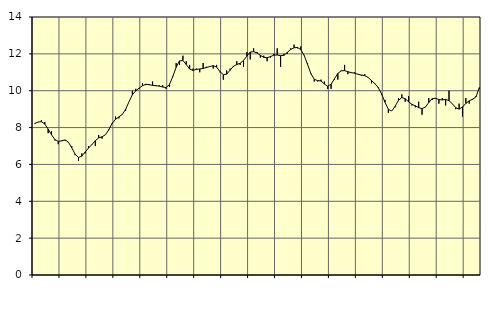
| Category | Piggar | Series 1 |
|---|---|---|
| nan | 8.2 | 8.22 |
| 87.0 | 8.3 | 8.3 |
| 87.0 | 8.4 | 8.32 |
| 87.0 | 8.3 | 8.19 |
| nan | 7.7 | 7.92 |
| 88.0 | 7.8 | 7.61 |
| 88.0 | 7.3 | 7.35 |
| 88.0 | 7.1 | 7.25 |
| nan | 7.3 | 7.28 |
| 89.0 | 7.3 | 7.33 |
| 89.0 | 7.2 | 7.21 |
| 89.0 | 7 | 6.9 |
| nan | 6.5 | 6.56 |
| 90.0 | 6.2 | 6.38 |
| 90.0 | 6.6 | 6.45 |
| 90.0 | 6.6 | 6.68 |
| nan | 7 | 6.89 |
| 91.0 | 7.1 | 7.08 |
| 91.0 | 7 | 7.29 |
| 91.0 | 7.6 | 7.44 |
| nan | 7.4 | 7.5 |
| 92.0 | 7.6 | 7.61 |
| 92.0 | 7.9 | 7.88 |
| 92.0 | 8.2 | 8.23 |
| nan | 8.6 | 8.45 |
| 93.0 | 8.5 | 8.58 |
| 93.0 | 8.7 | 8.71 |
| 93.0 | 8.9 | 8.99 |
| nan | 9.4 | 9.4 |
| 94.0 | 10 | 9.78 |
| 94.0 | 10.1 | 9.99 |
| 94.0 | 10.1 | 10.14 |
| nan | 10.4 | 10.27 |
| 95.0 | 10.3 | 10.35 |
| 95.0 | 10.3 | 10.33 |
| 95.0 | 10.5 | 10.29 |
| nan | 10.3 | 10.27 |
| 96.0 | 10.3 | 10.25 |
| 96.0 | 10.3 | 10.2 |
| 96.0 | 10.1 | 10.17 |
| nan | 10.2 | 10.33 |
| 97.0 | 10.8 | 10.77 |
| 97.0 | 11.5 | 11.27 |
| 97.0 | 11.4 | 11.62 |
| nan | 11.9 | 11.64 |
| 98.0 | 11.6 | 11.42 |
| 98.0 | 11.4 | 11.18 |
| 98.0 | 11.2 | 11.1 |
| nan | 11.2 | 11.16 |
| 99.0 | 11 | 11.18 |
| 99.0 | 11.5 | 11.21 |
| 99.0 | 11.3 | 11.26 |
| nan | 11.3 | 11.31 |
| 0.0 | 11.2 | 11.36 |
| 0.0 | 11.4 | 11.28 |
| 0.0 | 11 | 11.04 |
| nan | 10.6 | 10.87 |
| 1.0 | 11.1 | 10.9 |
| 1.0 | 11.2 | 11.11 |
| 1.0 | 11.3 | 11.33 |
| nan | 11.6 | 11.42 |
| 2.0 | 11.4 | 11.49 |
| 2.0 | 11.3 | 11.64 |
| 2.0 | 12.1 | 11.88 |
| nan | 11.7 | 12.1 |
| 3.0 | 12.3 | 12.12 |
| 3.0 | 12.1 | 12.05 |
| 3.0 | 11.8 | 11.92 |
| nan | 11.9 | 11.81 |
| 4.0 | 11.6 | 11.79 |
| 4.0 | 11.8 | 11.85 |
| 4.0 | 12 | 11.93 |
| nan | 12.3 | 11.94 |
| 5.0 | 11.3 | 11.9 |
| 5.0 | 12 | 11.92 |
| 5.0 | 12 | 12.08 |
| nan | 12.3 | 12.24 |
| 6.0 | 12.5 | 12.33 |
| 6.0 | 12.3 | 12.35 |
| 6.0 | 12.4 | 12.23 |
| nan | 11.9 | 11.92 |
| 7.0 | 11.5 | 11.43 |
| 7.0 | 10.9 | 10.93 |
| 7.0 | 10.5 | 10.62 |
| nan | 10.5 | 10.55 |
| 8.0 | 10.6 | 10.53 |
| 8.0 | 10.5 | 10.36 |
| 8.0 | 10.1 | 10.24 |
| nan | 10.1 | 10.35 |
| 9.0 | 10.6 | 10.65 |
| 9.0 | 10.6 | 10.94 |
| 9.0 | 11.1 | 11.08 |
| nan | 11.4 | 11.09 |
| 10.0 | 10.9 | 11.03 |
| 10.0 | 11 | 10.98 |
| 10.0 | 11 | 10.95 |
| nan | 10.9 | 10.89 |
| 11.0 | 10.8 | 10.85 |
| 11.0 | 10.9 | 10.82 |
| 11.0 | 10.7 | 10.72 |
| nan | 10.4 | 10.55 |
| 12.0 | 10.4 | 10.38 |
| 12.0 | 10.2 | 10.17 |
| 12.0 | 9.8 | 9.82 |
| nan | 9.5 | 9.37 |
| 13.0 | 8.8 | 8.99 |
| 13.0 | 8.9 | 8.9 |
| 13.0 | 9.1 | 9.15 |
| nan | 9.6 | 9.48 |
| 14.0 | 9.8 | 9.63 |
| 14.0 | 9.4 | 9.57 |
| 14.0 | 9.7 | 9.4 |
| nan | 9.2 | 9.26 |
| 15.0 | 9.1 | 9.18 |
| 15.0 | 9.4 | 9.08 |
| 15.0 | 8.7 | 9.03 |
| nan | 9.1 | 9.11 |
| 16.0 | 9.6 | 9.36 |
| 16.0 | 9.5 | 9.57 |
| 16.0 | 9.6 | 9.59 |
| nan | 9.3 | 9.52 |
| 17.0 | 9.6 | 9.5 |
| 17.0 | 9.2 | 9.53 |
| 17.0 | 10 | 9.46 |
| nan | 9.3 | 9.29 |
| 18.0 | 9 | 9.08 |
| 18.0 | 9.3 | 9 |
| 18.0 | 8.6 | 9.12 |
| nan | 9.6 | 9.31 |
| 19.0 | 9.3 | 9.45 |
| 19.0 | 9.5 | 9.54 |
| 19.0 | 9.7 | 9.66 |
| nan | 10.1 | 10.17 |